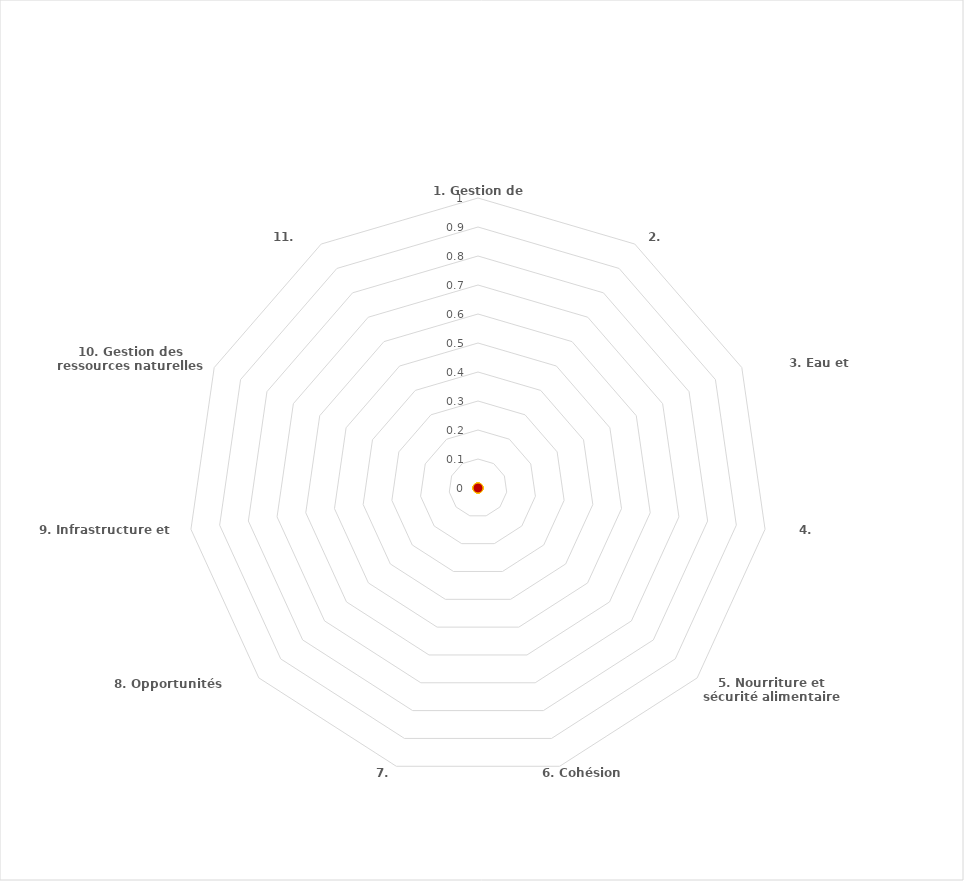
| Category | Series 0 | Series 1 | Series 2 | Series 3 |
|---|---|---|---|---|
| 1. Gestion de risque |  |  |  | 0 |
| 2. Santé |  |  |  | 0 |
| 3. Eau et assainissement |  |  |  | 0 |
| 4. Logement |  |  |  | 0 |
| 5. Nourriture et sécurité alimentaire |  |  |  | 0 |
| 6. Cohésion sociale |  |  |  | 0 |
| 7. Inclusion |  |  |  | 0 |
| 8. Opportunités économiques |  |  |  | 0 |
| 9. Infrastructure et services |  |  |  | 0 |
| 10. Gestion des ressources naturelles |  |  |  | 0 |
| 11. Connectivité |  |  |  | 0 |